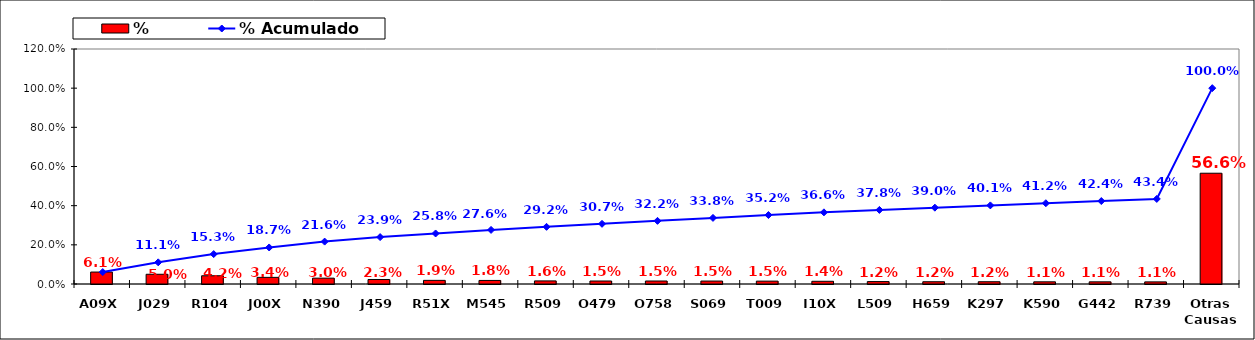
| Category | % |
|---|---|
| A09X | 0.061 |
| J029 | 0.05 |
| R104 | 0.042 |
| J00X | 0.034 |
| N390 | 0.03 |
| J459 | 0.023 |
| R51X | 0.019 |
| M545 | 0.018 |
| R509 | 0.016 |
| O479 | 0.015 |
| O758 | 0.015 |
| S069 | 0.015 |
| T009 | 0.015 |
| I10X | 0.014 |
| L509 | 0.012 |
| H659 | 0.012 |
| K297 | 0.012 |
| K590 | 0.011 |
| G442 | 0.011 |
| R739 | 0.011 |
| Otras Causas | 0.566 |